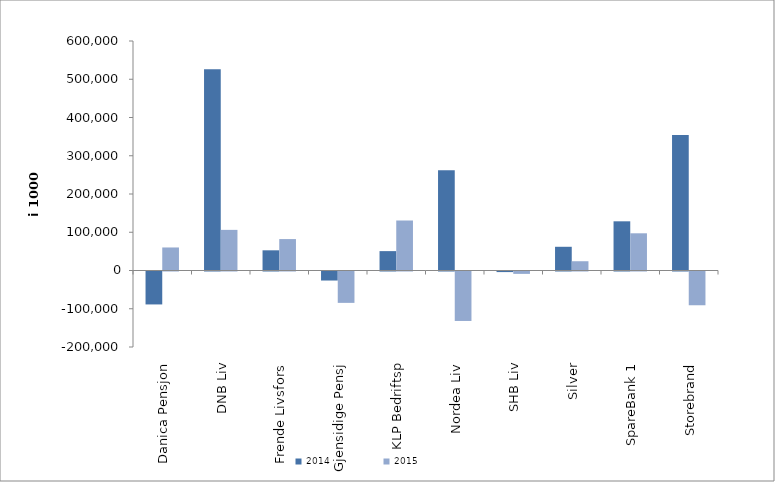
| Category | 2014 | 2015 |
|---|---|---|
| Danica Pensjon | -86112.116 | 60202.513 |
| DNB Liv | 526340 | 106208 |
| Frende Livsfors | 52793 | 82162 |
| Gjensidige Pensj | -23604.649 | -82011.826 |
| KLP Bedriftsp | 50664 | 130702 |
| Nordea Liv | 261791 | -129309.974 |
| SHB Liv | -1550 | -6245 |
| Silver | 61991.657 | 24227.527 |
| SpareBank 1 | 128609.181 | 97268.581 |
| Storebrand | 354430.898 | -88254.657 |